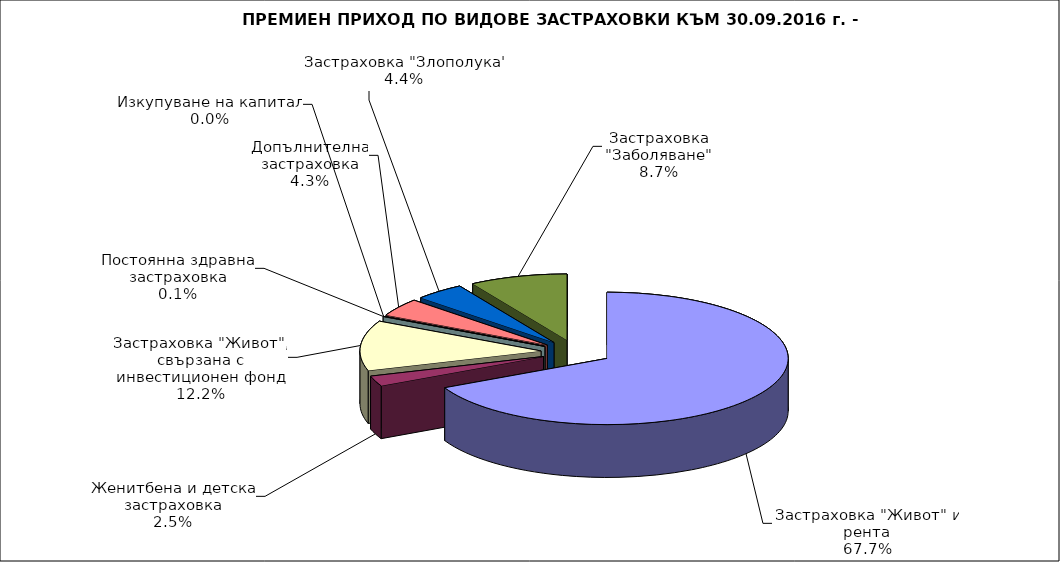
| Category | Series 0 |
|---|---|
| Застраховка "Живот" и рента | 0.677 |
| Женитбена и детска застраховка | 0.025 |
| Застраховка "Живот", свързана с инвестиционен фонд | 0.122 |
| Постоянна здравна застраховка | 0.001 |
| Изкупуване на капитал | 0 |
| Допълнителна застраховка | 0.043 |
| Застраховка "Злополука" | 0.044 |
| Застраховка "Заболяване" | 0.087 |